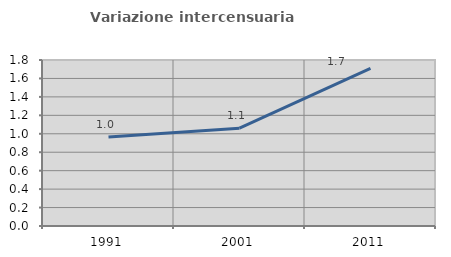
| Category | Variazione intercensuaria annua |
|---|---|
| 1991.0 | 0.965 |
| 2001.0 | 1.06 |
| 2011.0 | 1.709 |